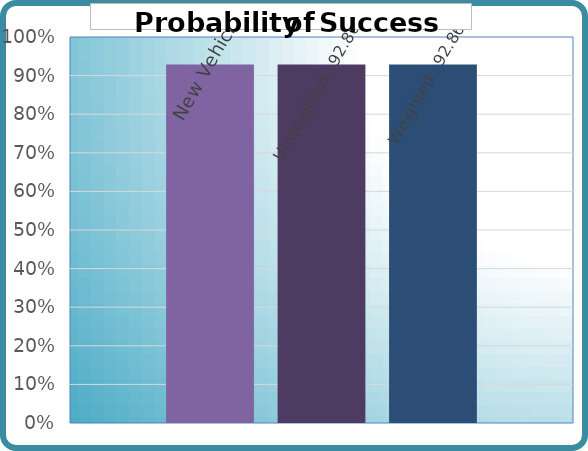
| Category |   | New Vehicles | Unweighted: | Weighted: |
|---|---|---|---|---|
| 0 |  | 0.929 | 0.929 | 0.929 |